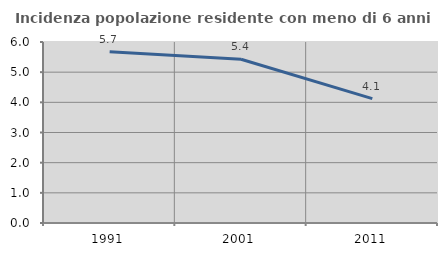
| Category | Incidenza popolazione residente con meno di 6 anni |
|---|---|
| 1991.0 | 5.68 |
| 2001.0 | 5.428 |
| 2011.0 | 4.122 |